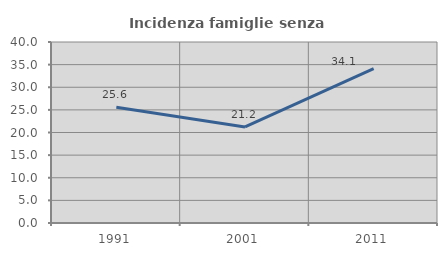
| Category | Incidenza famiglie senza nuclei |
|---|---|
| 1991.0 | 25.57 |
| 2001.0 | 21.233 |
| 2011.0 | 34.124 |